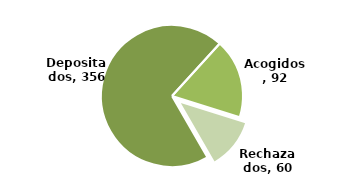
| Category | Series 0 |
|---|---|
| Depositados | 356 |
| Acogidos | 92 |
| Rechazados | 60 |